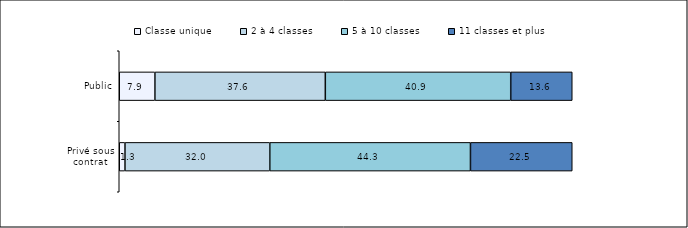
| Category | Classe unique | 2 à 4 classes | 5 à 10 classes | 11 classes et plus |
|---|---|---|---|---|
| Privé sous contrat | 1.26 | 31.97 | 44.3 | 22.47 |
| Public | 7.87 | 37.62 | 40.93 | 13.58 |